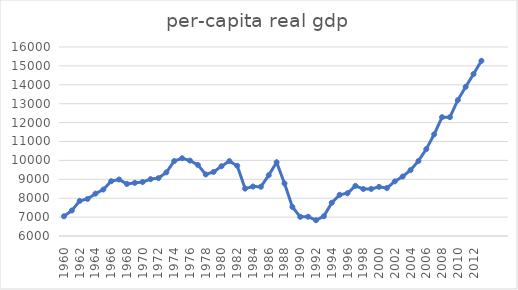
| Category | per-capita real gdp |
|---|---|
| 1960.0 | 7043.198 |
| 1961.0 | 7348.667 |
| 1962.0 | 7856.226 |
| 1963.0 | 7962.091 |
| 1964.0 | 8241.576 |
| 1965.0 | 8459.097 |
| 1966.0 | 8900.597 |
| 1967.0 | 8987.653 |
| 1968.0 | 8753.286 |
| 1969.0 | 8811.53 |
| 1970.0 | 8857.028 |
| 1971.0 | 9007.245 |
| 1972.0 | 9062.395 |
| 1973.0 | 9365.728 |
| 1974.0 | 9965.16 |
| 1975.0 | 10113.976 |
| 1976.0 | 9988.892 |
| 1977.0 | 9762.416 |
| 1978.0 | 9258.761 |
| 1979.0 | 9389.093 |
| 1980.0 | 9690.264 |
| 1981.0 | 9963.56 |
| 1982.0 | 9712.596 |
| 1983.0 | 8506.051 |
| 1984.0 | 8618.274 |
| 1985.0 | 8605.342 |
| 1986.0 | 9215.865 |
| 1987.0 | 9900.296 |
| 1988.0 | 8779.43 |
| 1989.0 | 7537.989 |
| 1990.0 | 7013.519 |
| 1991.0 | 7019.255 |
| 1992.0 | 6836.564 |
| 1993.0 | 7047.426 |
| 1994.0 | 7759.197 |
| 1995.0 | 8180.729 |
| 1996.0 | 8263.202 |
| 1997.0 | 8653.822 |
| 1998.0 | 8487.017 |
| 1999.0 | 8489.98 |
| 2000.0 | 8599.719 |
| 2001.0 | 8538.551 |
| 2002.0 | 8889.393 |
| 2003.0 | 9145.864 |
| 2004.0 | 9485.999 |
| 2005.0 | 9967.324 |
| 2006.0 | 10599.261 |
| 2007.0 | 11378.895 |
| 2008.0 | 12288.664 |
| 2009.0 | 12287.781 |
| 2010.0 | 13187.809 |
| 2011.0 | 13894.257 |
| 2012.0 | 14571.273 |
| 2013.0 | 15269.373 |